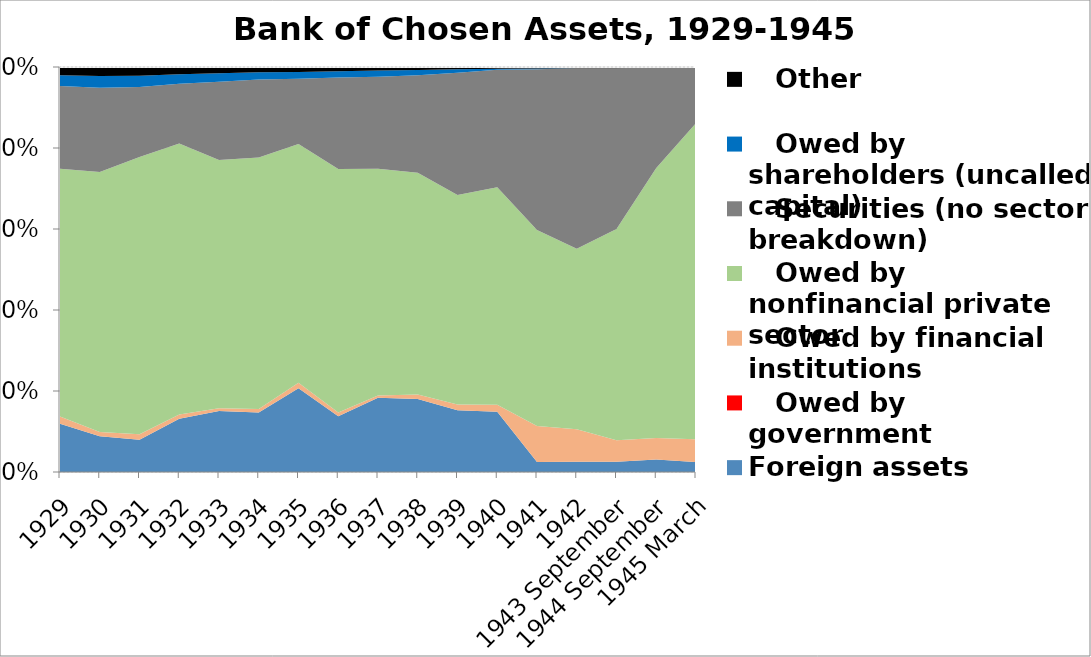
| Category | Foreign assets |    Owed by government |    Owed by financial institutions |    Owed by nonfinancial private sector |    Securities (no sector breakdown) |    Owed by shareholders (uncalled capital) |    Other |
|---|---|---|---|---|---|---|---|
| 1929 | 66670905 | 0 | 9868205 | 342303729 | 114070200 | 15000000 | 11318308 |
| 1930 | 45113501 | 0 | 5620055 | 329059068 | 106459605 | 15000000 | 11352118 |
| 1931 | 42225183 | 0 | 7239563 | 364630626 | 91801350 | 15000000 | 11356141 |
| 1932 | 83291112 | 0 | 6572176 | 423911371 | 93341808 | 15000000 | 11184674 |
| 1933 | 108066764 | 0 | 4682481 | 439555431 | 138664538 | 15000000 | 11130792 |
| 1934 | 122719129 | 0 | 7050792 | 519257601 | 160634783 | 15000000 | 10966031 |
| 1935 | 181257237 | 0 | 11820551 | 517157353 | 140736981 | 15000000 | 10698576 |
| 1936 | 137244948 | 0 | 9634923 | 600565648 | 225943250 | 15000000 | 10634487 |
| 1937 | 179215315 | 0 | 5277584 | 546583697 | 221527805 | 15000000 | 8566258 |
| 1938 | 211230990 | 0 | 13321526 | 642371302 | 282488504 | 15000000 | 8818141 |
| 1939 | 253709256 | 0 | 23286543 | 860730228 | 502430438 | 15000000 | 9050100 |
| 1940 | 305689694 | 0 | 35772369 | 1102733552 | 594661636 | 5000000 | 9499230 |
| 1941 | 64990864 | 0 | 237154802 | 1286263670 | 1056305057 | 5000000 | 9858736 |
| 1942 | 89143346 | 0 | 282979949 | 1576553849 | 1572851286 | 0 | 11945678 |
| 1943 September | 114435024 | 0 | 240350731 | 2353044509 | 1794232882 | 0 | 12760596 |
| 1944 September | 364568657 | 0 | 617514243 | 7814937517 | 2903243187 | 0 | 15795109 |
| 1945 March | 617167591 | 0 | 1399012192 | 19424223206 | 3399989272 | 30000000 | 21731214 |